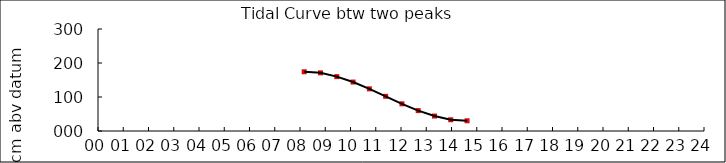
| Category | Height cm |
|---|---|
| 8.166666666666666 | 174.207 |
| 8.811666666666666 | 171 |
| 9.456666666666665 | 160 |
| 10.10166666666667 | 144 |
| 10.74666666666667 | 124 |
| 11.39166666666667 | 102 |
| 12.03666666666667 | 80 |
| 12.68166666666666 | 60 |
| 13.32666666666666 | 44 |
| 13.97166666666666 | 33 |
| 14.61666666666667 | 30 |